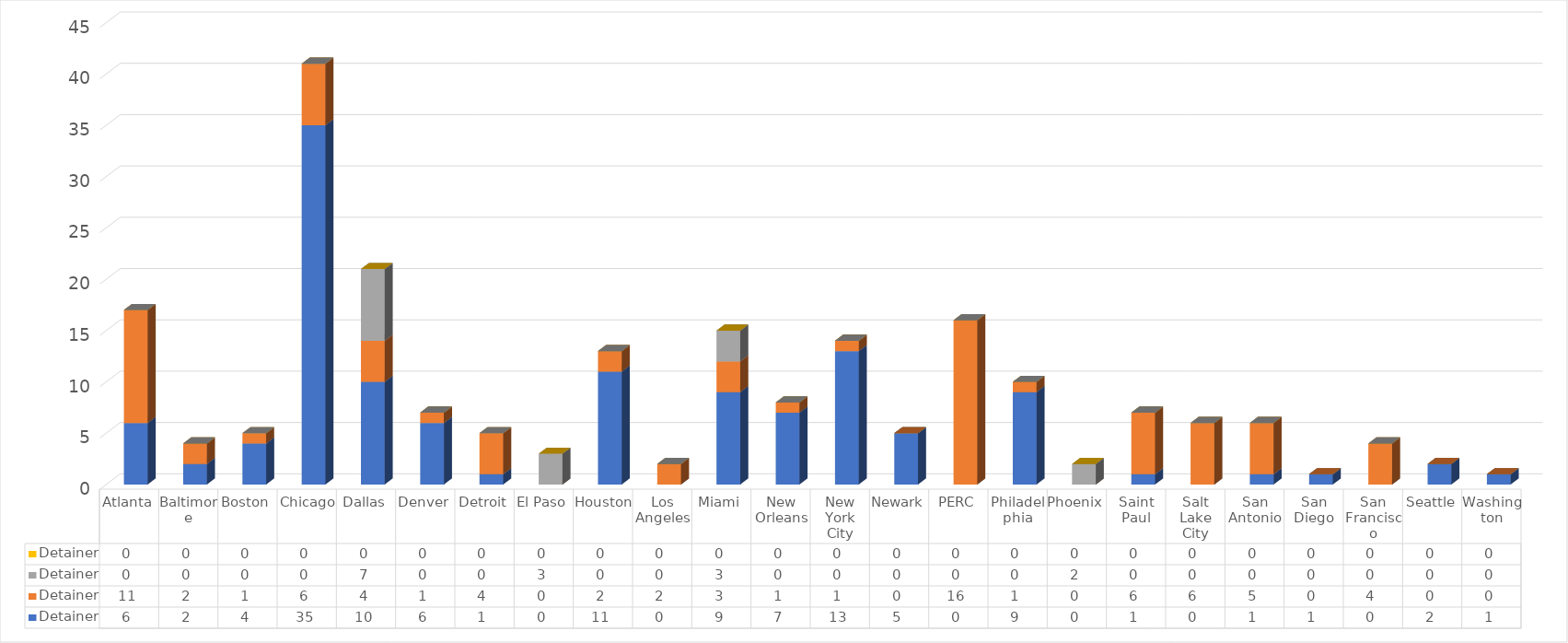
| Category | Sum of Other Priority - Detainer | Sum of Public Safety - Detainer | Sum of Border Security - Detainer | Sum of National Security - Detainer |
|---|---|---|---|---|
| Atlanta | 6 | 11 | 0 | 0 |
| Baltimore | 2 | 2 | 0 | 0 |
| Boston | 4 | 1 | 0 | 0 |
| Chicago | 35 | 6 | 0 | 0 |
| Dallas | 10 | 4 | 7 | 0 |
| Denver | 6 | 1 | 0 | 0 |
| Detroit | 1 | 4 | 0 | 0 |
| El Paso | 0 | 0 | 3 | 0 |
| Houston | 11 | 2 | 0 | 0 |
| Los Angeles | 0 | 2 | 0 | 0 |
| Miami | 9 | 3 | 3 | 0 |
| New Orleans | 7 | 1 | 0 | 0 |
| New York City | 13 | 1 | 0 | 0 |
| Newark | 5 | 0 | 0 | 0 |
| PERC | 0 | 16 | 0 | 0 |
| Philadelphia | 9 | 1 | 0 | 0 |
| Phoenix | 0 | 0 | 2 | 0 |
| Saint Paul | 1 | 6 | 0 | 0 |
| Salt Lake City | 0 | 6 | 0 | 0 |
| San Antonio | 1 | 5 | 0 | 0 |
| San Diego | 1 | 0 | 0 | 0 |
| San Francisco | 0 | 4 | 0 | 0 |
| Seattle | 2 | 0 | 0 | 0 |
| Washington | 1 | 0 | 0 | 0 |